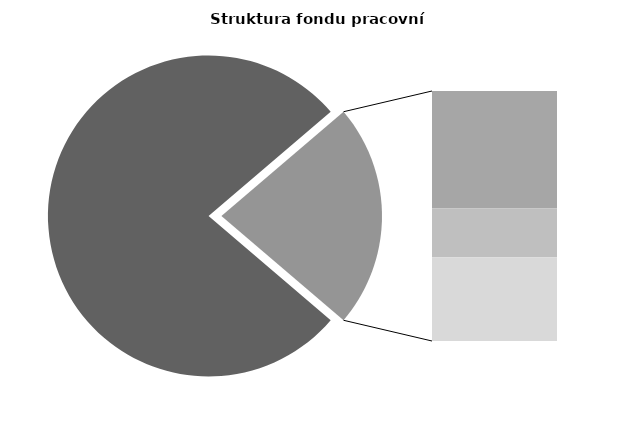
| Category | Series 0 |
|---|---|
| Průměrná měsíční odpracovaná doba bez přesčasu | 134.401 |
| Dovolená | 18.31 |
| Nemoc | 7.645 |
| Jiné | 13.056 |